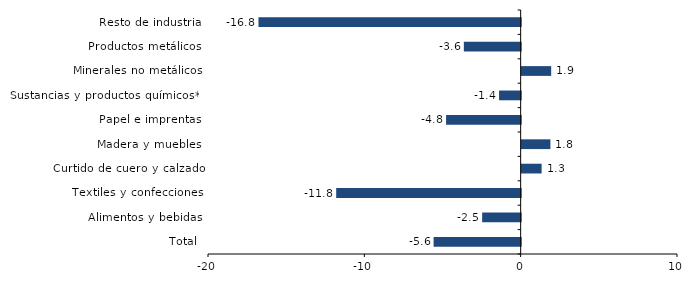
| Category | Series 0 |
|---|---|
| Total | -5.569 |
| Alimentos y bebidas | -2.464 |
| Textiles y confecciones | -11.801 |
| Curtido de cuero y calzado | 1.276 |
| Madera y muebles | 1.839 |
| Papel e imprentas | -4.772 |
| Sustancias y productos químicos** | -1.383 |
| Minerales no metálicos | 1.889 |
| Productos metálicos | -3.635 |
| Resto de industria | -16.772 |